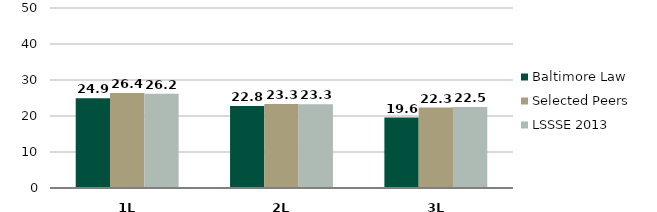
| Category | Baltimore Law | Selected Peers | LSSSE 2013 |
|---|---|---|---|
| 0 | 24.902 | 26.398 | 26.204 |
| 1 | 22.792 | 23.316 | 23.293 |
| 2 | 19.583 | 22.348 | 22.477 |